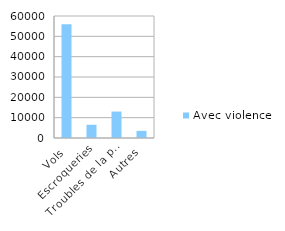
| Category | Avec violence |
|---|---|
| Vols | 56000 |
| Escroqueries | 6500 |
| Troubles de la paix publique | 13000 |
| Autres | 3500 |